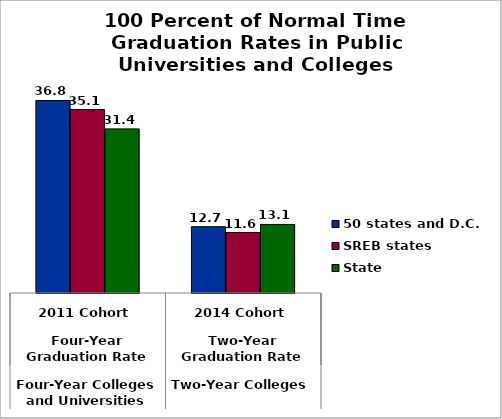
| Category | 50 states and D.C. | SREB states | State |
|---|---|---|---|
| 0 | 36.843 | 35.107 | 31.408 |
| 1 | 12.689 | 11.568 | 13.119 |